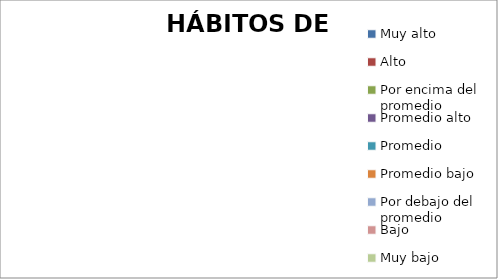
| Category | Muy alto |
|---|---|
| Muy alto | 0 |
| Alto | 0 |
| Por encima del promedio | 0 |
| Promedio alto | 0 |
| Promedio | 0 |
| Promedio bajo | 0 |
| Por debajo del promedio | 0 |
| Bajo | 0 |
| Muy bajo | 0 |